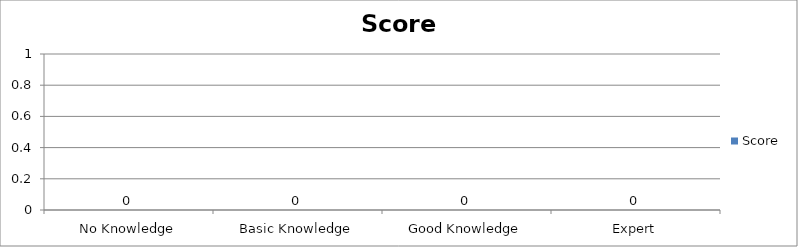
| Category | Score |
|---|---|
| No Knowledge | 0 |
| Basic Knowledge | 0 |
| Good Knowledge | 0 |
| Expert | 0 |